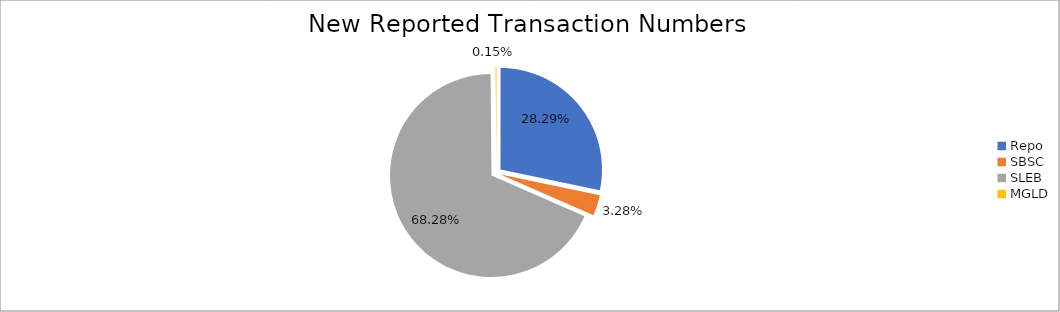
| Category | Series 0 |
|---|---|
| Repo | 379100 |
| SBSC | 43966 |
| SLEB | 914970 |
| MGLD | 1994 |